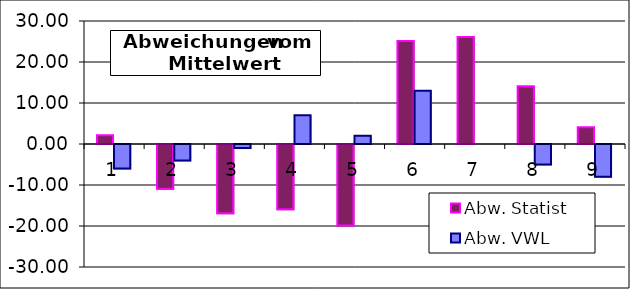
| Category | Abw. Statist | Abw. VWL |
|---|---|---|
| 0 | 2.111 | -6 |
| 1 | -10.889 | -4 |
| 2 | -16.889 | -1 |
| 3 | -15.889 | 7 |
| 4 | -19.889 | 2 |
| 5 | 25.111 | 13 |
| 6 | 26.111 | 0 |
| 7 | 14.111 | -5 |
| 8 | 4.111 | -8 |